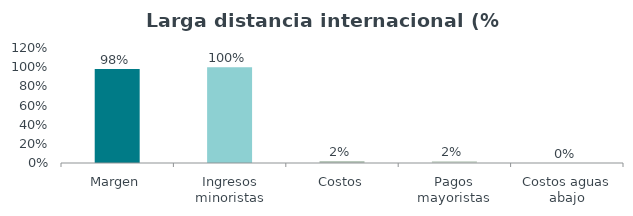
| Category | Series 0 |
|---|---|
| Margen | 0.98 |
| Ingresos minoristas | 1 |
| Costos | 0.02 |
| Pagos mayoristas | 0.02 |
| Costos aguas abajo | 0 |